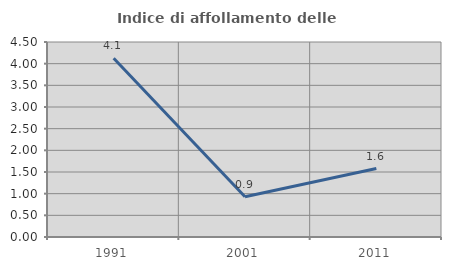
| Category | Indice di affollamento delle abitazioni  |
|---|---|
| 1991.0 | 4.126 |
| 2001.0 | 0.93 |
| 2011.0 | 1.58 |